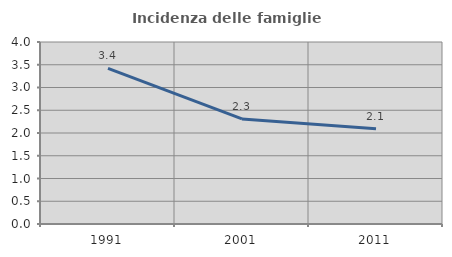
| Category | Incidenza delle famiglie numerose |
|---|---|
| 1991.0 | 3.419 |
| 2001.0 | 2.309 |
| 2011.0 | 2.091 |